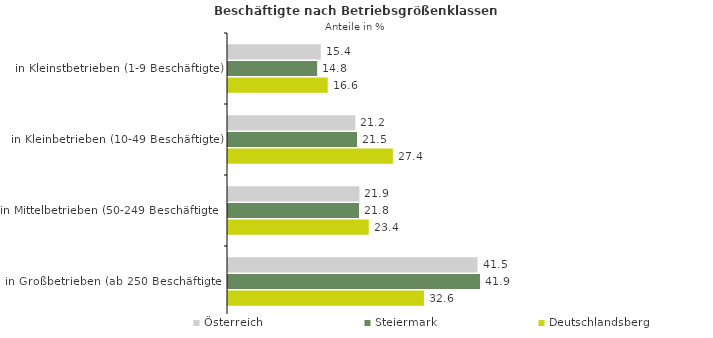
| Category | Österreich | Steiermark | Deutschlandsberg |
|---|---|---|---|
| in Kleinstbetrieben (1-9 Beschäftigte) | 15.439 | 14.827 | 16.588 |
| in Kleinbetrieben (10-49 Beschäftigte) | 21.184 | 21.458 | 27.421 |
| in Mittelbetrieben (50-249 Beschäftigte) | 21.859 | 21.796 | 23.408 |
| in Großbetrieben (ab 250 Beschäftigte) | 41.518 | 41.919 | 32.582 |